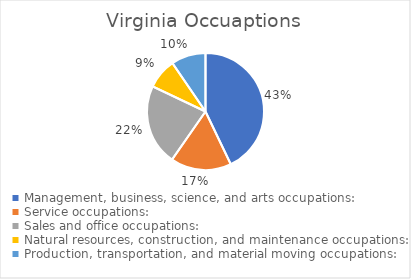
| Category | Series 0 |
|---|---|
| Management, business, science, and arts occupations: | 1731299 |
| Service occupations: | 677558 |
| Sales and office occupations: | 902731 |
| Natural resources, construction, and maintenance occupations: | 339501 |
| Production, transportation, and material moving occupations: | 385367 |